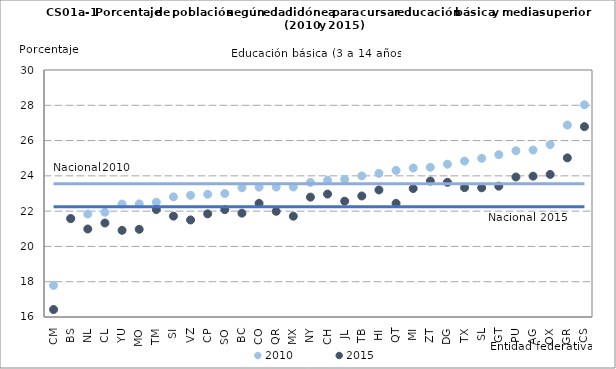
| Category | 2010 | 2015 | N_10 | N_15 |
|---|---|---|---|---|
| CM | 17.792 | 16.423 | 23.554 | 22.255 |
| BS | 21.591 | 21.577 | 23.554 | 22.255 |
| NL | 21.836 | 20.988 | 23.554 | 22.255 |
| CL | 21.937 | 21.327 | 23.554 | 22.255 |
| YU | 22.402 | 20.913 | 23.554 | 22.255 |
| MO | 22.412 | 20.972 | 23.554 | 22.255 |
| TM | 22.504 | 22.089 | 23.554 | 22.255 |
| SI | 22.812 | 21.716 | 23.554 | 22.255 |
| VZ | 22.896 | 21.501 | 23.554 | 22.255 |
| CP | 22.955 | 21.848 | 23.554 | 22.255 |
| SO | 22.995 | 22.084 | 23.554 | 22.255 |
| BC | 23.322 | 21.887 | 23.554 | 22.255 |
| CO | 23.361 | 22.441 | 23.554 | 22.255 |
| QR | 23.362 | 21.991 | 23.554 | 22.255 |
| MX | 23.372 | 21.713 | 23.554 | 22.255 |
| NY | 23.626 | 22.793 | 23.554 | 22.255 |
| CH | 23.747 | 22.967 | 23.554 | 22.255 |
| JL | 23.797 | 22.566 | 23.554 | 22.255 |
| TB | 23.996 | 22.86 | 23.554 | 22.255 |
| HI | 24.143 | 23.201 | 23.554 | 22.255 |
| QT | 24.312 | 22.442 | 23.554 | 22.255 |
| MI | 24.446 | 23.281 | 23.554 | 22.255 |
| ZT | 24.486 | 23.704 | 23.554 | 22.255 |
| DG | 24.658 | 23.632 | 23.554 | 22.255 |
| TX | 24.835 | 23.334 | 23.554 | 22.255 |
| SL | 24.993 | 23.323 | 23.554 | 22.255 |
| GT | 25.198 | 23.416 | 23.554 | 22.255 |
| PU | 25.422 | 23.936 | 23.554 | 22.255 |
| AG | 25.463 | 23.982 | 23.554 | 22.255 |
| OX | 25.772 | 24.081 | 23.554 | 22.255 |
| GR | 26.88 | 25.019 | 23.554 | 22.255 |
| CS | 28.031 | 26.79 | 23.554 | 22.255 |